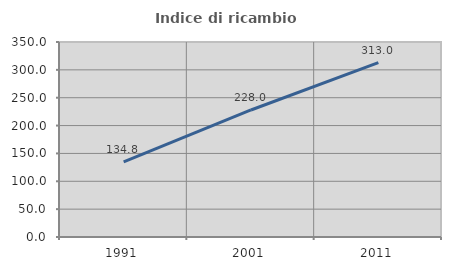
| Category | Indice di ricambio occupazionale  |
|---|---|
| 1991.0 | 134.812 |
| 2001.0 | 228 |
| 2011.0 | 312.994 |